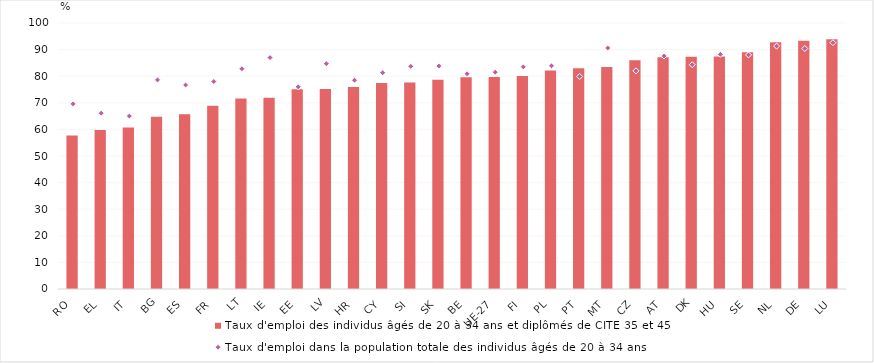
| Category | Taux d'emploi des individus âgés de 20 à 34 ans et diplômés de CITE 35 et 45  |
|---|---|
| RO | 57.7 |
| EL | 59.8 |
| IT | 60.7 |
| BG | 64.8 |
| ES | 65.7 |
| FR | 68.9 |
| LT | 71.6 |
| IE | 71.9 |
| EE | 75.1 |
| LV | 75.2 |
| HR | 75.9 |
| CY | 77.4 |
| SI | 77.6 |
| SK | 78.7 |
| BE | 79.6 |
| UE-27 | 79.7 |
| FI | 80.1 |
| PL | 82.1 |
| PT | 83 |
| MT | 83.5 |
| CZ | 86 |
| AT | 87.1 |
| DK | 87.3 |
| HU | 87.4 |
| SE | 89 |
| NL | 92.8 |
| DE | 93.3 |
| LU | 93.9 |